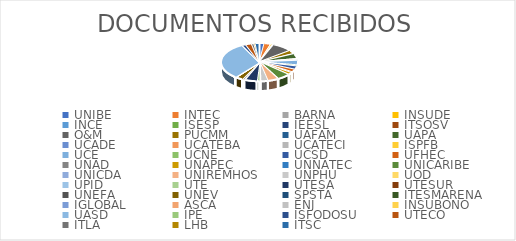
| Category | Series 0 |
|---|---|
| UNIBE | 348 |
| INTEC | 478 |
| BARNA | 3 |
| INSUDE | 116 |
| INCE | 57 |
| ISESP | 1 |
| IEESL | 22 |
| ITSOSV | 5 |
| O&M | 1402 |
| PUCMM | 504 |
| UAFAM | 47 |
| UAPA | 701 |
| UCADE | 17 |
| UCATEBA | 112 |
| UCATECI | 104 |
| ISPFB | 3 |
| UCE | 645 |
| UCNE | 154 |
| UCSD | 466 |
| UFHEC | 402 |
| UNAD | 123 |
| UNAPEC | 300 |
| UNNATEC | 13 |
| UNICARIBE | 898 |
| UNICDA | 34 |
| UNIREMHOS | 740 |
| UNPHU | 498 |
| UOD | 49 |
| UPID | 17 |
| UTE | 182 |
| UTESA | 860 |
| UTESUR | 67 |
| UNEFA | 122 |
| UNEV | 515 |
| SPSTA | 10 |
| ITESMARENA | 4 |
| IGLOBAL | 2 |
| ASCA | 4 |
| ENJ | 7 |
| INSUBONO | 3 |
| UASD | 5244 |
| IPE | 17 |
| ISFODOSU | 261 |
| UTECO | 416 |
| ITLA | 175 |
| LHB | 92 |
| ITSC | 275 |